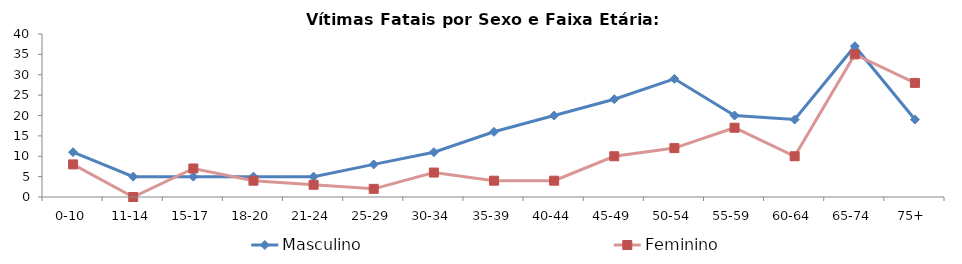
| Category | Masculino | Feminino |
|---|---|---|
| 0-10 | 11 | 8 |
| 11-14 | 5 | 0 |
| 15-17 | 5 | 7 |
| 18-20 | 5 | 4 |
| 21-24 | 5 | 3 |
| 25-29 | 8 | 2 |
| 30-34 | 11 | 6 |
| 35-39 | 16 | 4 |
| 40-44 | 20 | 4 |
| 45-49 | 24 | 10 |
| 50-54 | 29 | 12 |
| 55-59 | 20 | 17 |
| 60-64 | 19 | 10 |
| 65-74 | 37 | 35 |
| 75+ | 19 | 28 |